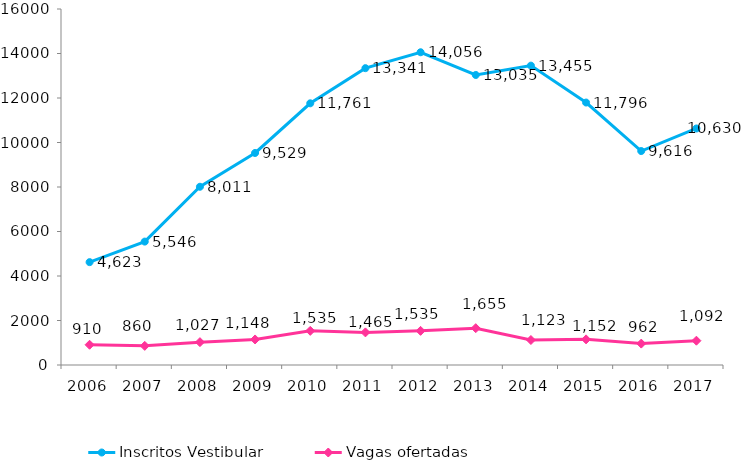
| Category | Inscritos Vestibular |
|---|---|
| 2006.0 | 4623 |
| 2007.0 | 5546 |
| 2008.0 | 8011 |
| 2009.0 | 9529 |
| 2010.0 | 11761 |
| 2011.0 | 13341 |
| 2012.0 | 14056 |
| 2013.0 | 13035 |
| 2014.0 | 13455 |
| 2015.0 | 11796 |
| 2016.0 | 9616 |
| 2017.0 | 10630 |